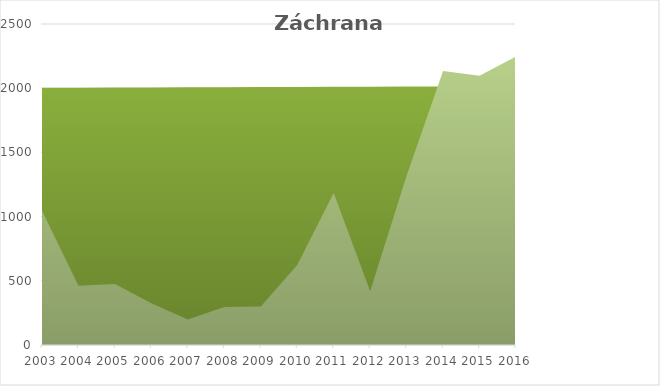
| Category | rok | počet |
|---|---|---|
| 2003.0 | 2003 | 1046 |
| 2004.0 | 2004 | 462 |
| 2005.0 | 2005 | 475 |
| 2006.0 | 2006 | 325 |
| 2007.0 | 2007 | 199 |
| 2008.0 | 2008 | 295 |
| 2009.0 | 2009 | 299 |
| 2010.0 | 2010 | 624 |
| 2011.0 | 2011 | 1183 |
| 2012.0 | 2012 | 419 |
| 2013.0 | 2013 | 1318 |
| 2014.0 | 2014 | 2133 |
| 2015.0 | 2015 | 2096 |
| 2016.0 | 2016 | 2247 |